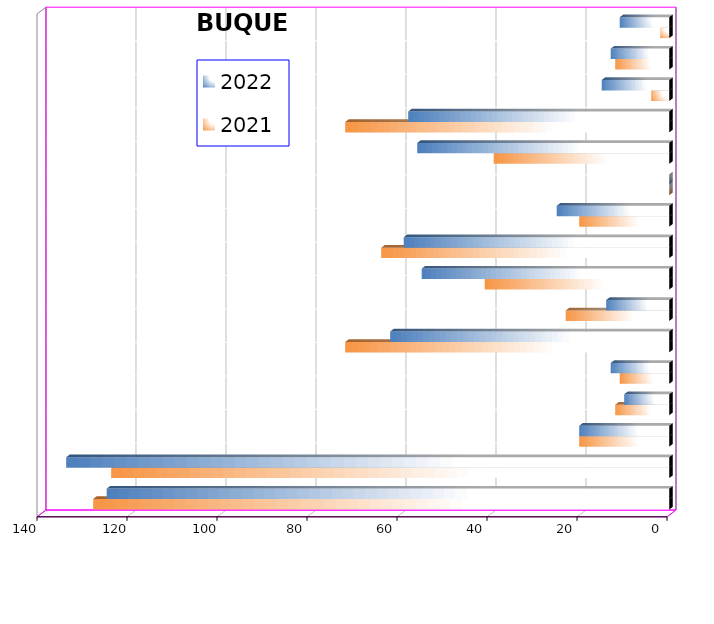
| Category | 2021 | 2022 |
|---|---|---|
| ICAVE | 128 | 125 |
| CICE | 124 | 134 |
| T. C. E. | 20 | 20 |
| CARGILL | 12 | 10 |
| TMV | 11 | 13 |
| SSA | 72 | 62 |
| SEPSA | 23 | 14 |
| VOPAK | 41 | 55 |
| CPV | 64 | 59 |
| EXCELLENCE | 20 | 25 |
| APASCO | 0 | 0 |
| SIPPB | 39 | 56 |
| PEMEX | 72 | 58 |
| PETRA | 4 | 15 |
| OPEVER | 12 | 13 |
| ESJ Renovable III | 2 | 11 |